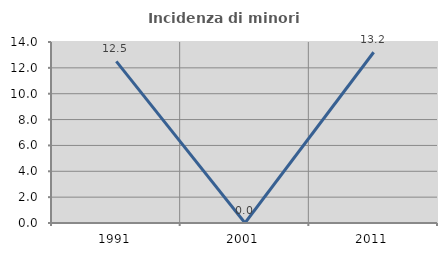
| Category | Incidenza di minori stranieri |
|---|---|
| 1991.0 | 12.5 |
| 2001.0 | 0 |
| 2011.0 | 13.208 |